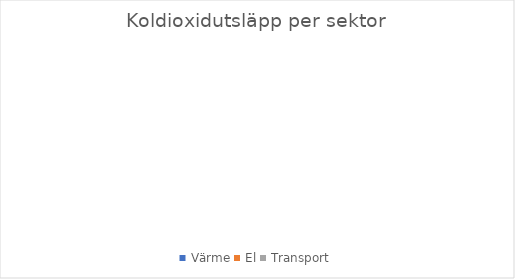
| Category | Koldioxidutsläpp per sektor |
|---|---|
| Värme | 0 |
| El | 0 |
| Transport | 0 |